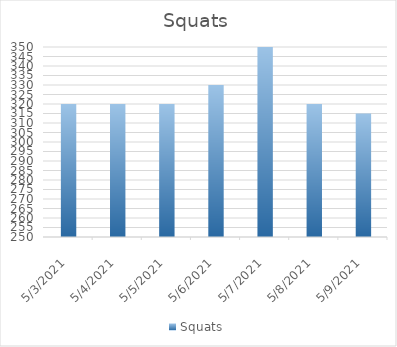
| Category | Squats |
|---|---|
| 5/3/21 | 320 |
| 5/4/21 | 320 |
| 5/5/21 | 320 |
| 5/6/21 | 330 |
| 5/7/21 | 350 |
| 5/8/21 | 320 |
| 5/9/21 | 315 |